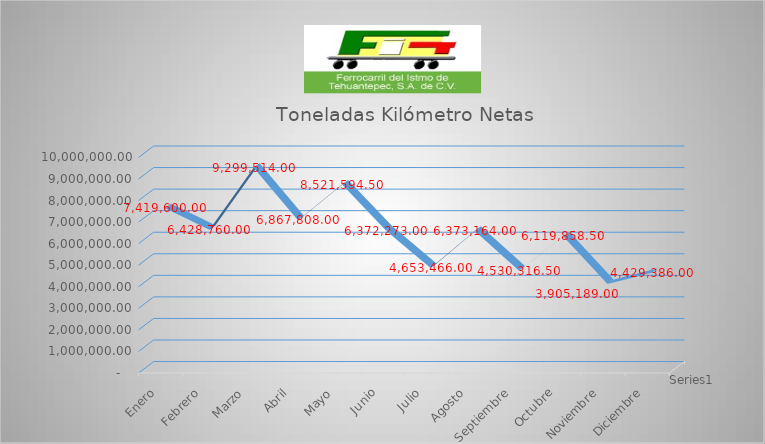
| Category | Series 0 |
|---|---|
| Enero | 7419600 |
| Febrero | 6428760 |
| Marzo | 9299514 |
| Abril | 6867808 |
| Mayo | 8521594.5 |
| Junio | 6372273 |
| Julio | 4653466 |
| Agosto | 6373164 |
| Septiembre | 4530316.5 |
| Octubre | 6119858.5 |
| Noviembre | 3905189 |
| Diciembre | 4429386 |